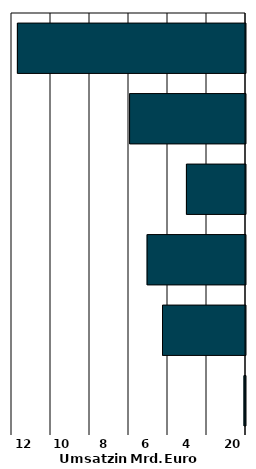
| Category | Series 0 |
|---|---|
| 0 | -0.077 |
| 1 | -4.256 |
| 2 | -5.045 |
| 3 | -3.029 |
| 4 | -5.944 |
| 5 | -11.697 |